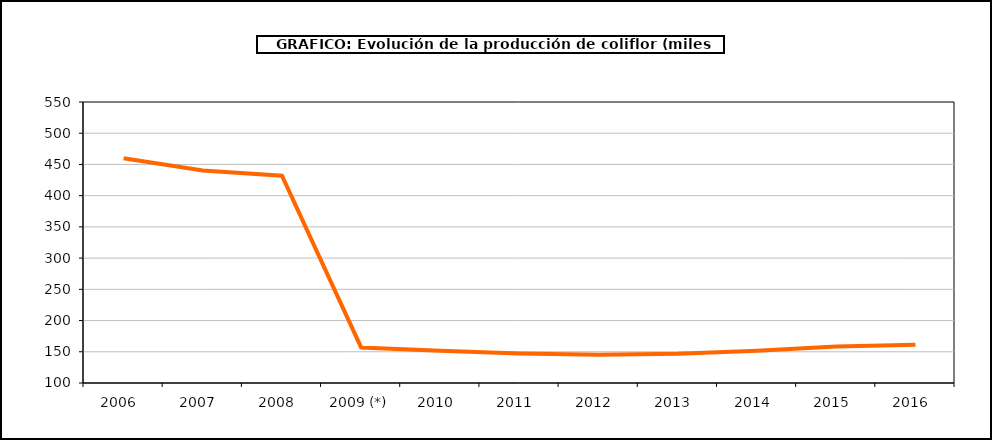
| Category | producción |
|---|---|
| 2006  | 460 |
| 2007  | 440.254 |
| 2008  | 431.911 |
| 2009 (*) | 156.937 |
| 2010  | 151.573 |
| 2011  | 147.3 |
| 2012  | 145.268 |
| 2013  | 146.724 |
| 2014  | 151.651 |
| 2015  | 158.34 |
| 2016  | 161.424 |